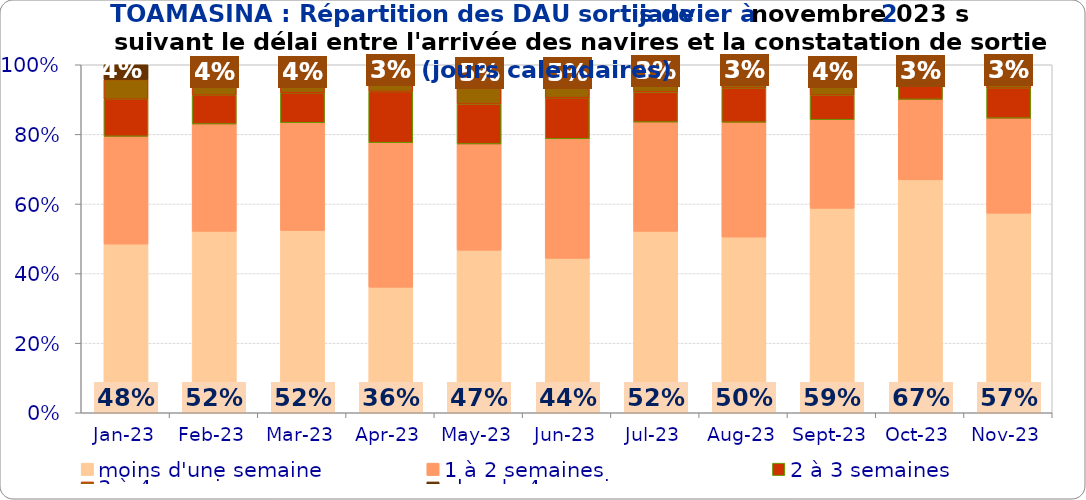
| Category | moins d'une semaine | 1 à 2 semaines | 2 à 3 semaines | 3 à 4 semaines | plus de 4 semaines |
|---|---|---|---|---|---|
| 2023-01-01 | 0.485 | 0.31 | 0.107 | 0.057 | 0.042 |
| 2023-02-01 | 0.521 | 0.309 | 0.083 | 0.047 | 0.041 |
| 2023-03-01 | 0.524 | 0.309 | 0.086 | 0.041 | 0.039 |
| 2023-04-01 | 0.361 | 0.415 | 0.147 | 0.046 | 0.03 |
| 2023-05-01 | 0.467 | 0.305 | 0.115 | 0.064 | 0.049 |
| 2023-06-01 | 0.444 | 0.343 | 0.118 | 0.048 | 0.047 |
| 2023-07-01 | 0.521 | 0.314 | 0.087 | 0.044 | 0.034 |
| 2023-08-01 | 0.505 | 0.33 | 0.098 | 0.04 | 0.028 |
| 2023-09-01 | 0.587 | 0.255 | 0.071 | 0.048 | 0.039 |
| 2023-10-01 | 0.669 | 0.231 | 0.05 | 0.017 | 0.032 |
| 2023-11-01 | 0.574 | 0.273 | 0.086 | 0.039 | 0.029 |